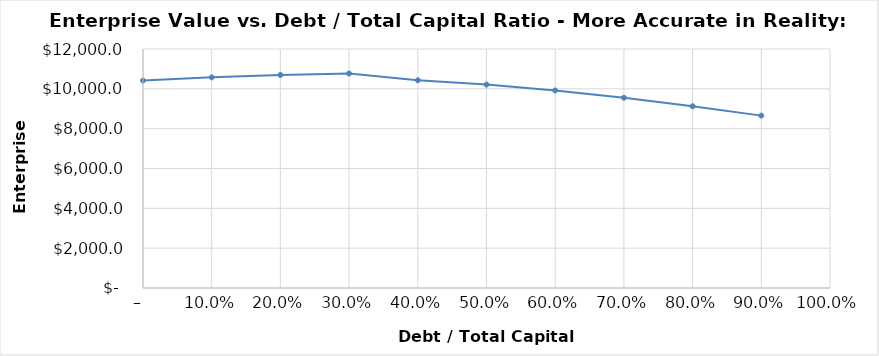
| Category | Series 0 |
|---|---|
| 0.0 | 10413.306 |
| 0.1 | 10576.314 |
| 0.2 | 10696.068 |
| 0.30000000000000004 | 10770.635 |
| 0.4 | 10431.449 |
| 0.5 | 10214.29 |
| 0.6 | 9918.108 |
| 0.7 | 9552.005 |
| 0.7999999999999999 | 9126.784 |
| 0.8999999999999999 | 8654.358 |